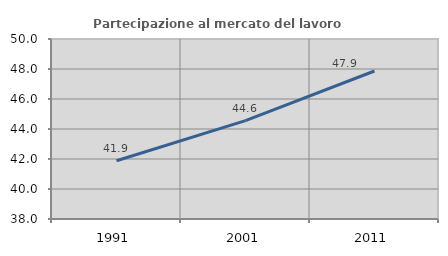
| Category | Partecipazione al mercato del lavoro  femminile |
|---|---|
| 1991.0 | 41.881 |
| 2001.0 | 44.557 |
| 2011.0 | 47.867 |